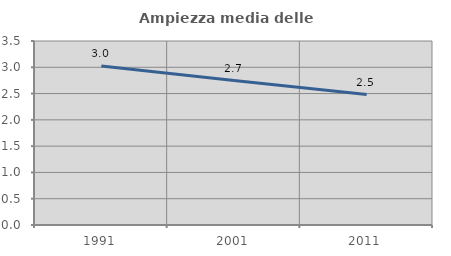
| Category | Ampiezza media delle famiglie |
|---|---|
| 1991.0 | 3.025 |
| 2001.0 | 2.747 |
| 2011.0 | 2.482 |